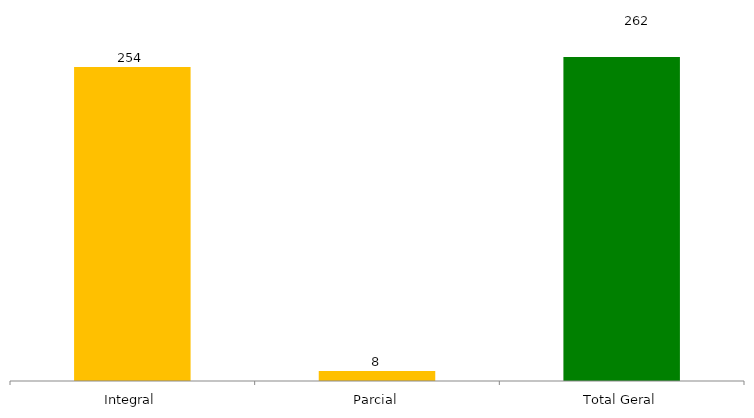
| Category | Categoria/Ano |
|---|---|
| Integral | 254 |
| Parcial | 8 |
| Total Geral | 262 |